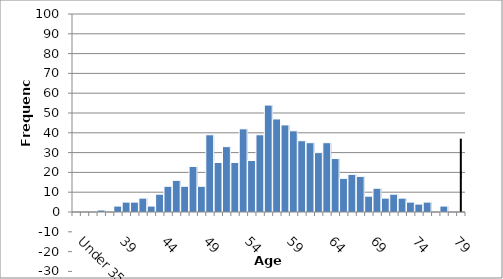
| Category | Frequency |
|---|---|
| Under 35 | 0 |
| 35 | 0 |
| 36 | 0 |
| 37 | 1 |
| 38 | 0 |
| 39 | 3 |
| 40 | 5 |
| 41 | 5 |
| 42 | 7 |
| 43 | 3 |
| 44 | 9 |
| 45 | 13 |
| 46 | 16 |
| 47 | 13 |
| 48 | 23 |
| 49 | 13 |
| 50 | 39 |
| 51 | 25 |
| 52 | 33 |
| 53 | 25 |
| 54 | 42 |
| 55 | 26 |
| 56 | 39 |
| 57 | 54 |
| 58 | 47 |
| 59 | 44 |
| 60 | 41 |
| 61 | 36 |
| 62 | 35 |
| 63 | 30 |
| 64 | 35 |
| 65 | 27 |
| 66 | 17 |
| 67 | 19 |
| 68 | 18 |
| 69 | 8 |
| 70 | 12 |
| 71 | 7 |
| 72 | 9 |
| 73 | 7 |
| 74 | 5 |
| 75 | 4 |
| 76 | 5 |
| 77 | 0 |
| 78 | 3 |
| 79 | 0 |
| 80+ | 0 |